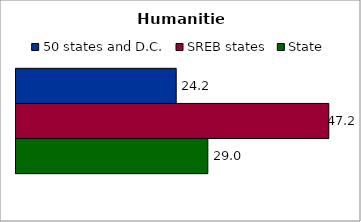
| Category | 50 states and D.C. | SREB states | State |
|---|---|---|---|
| 0 | 24.201 | 47.25 | 28.975 |